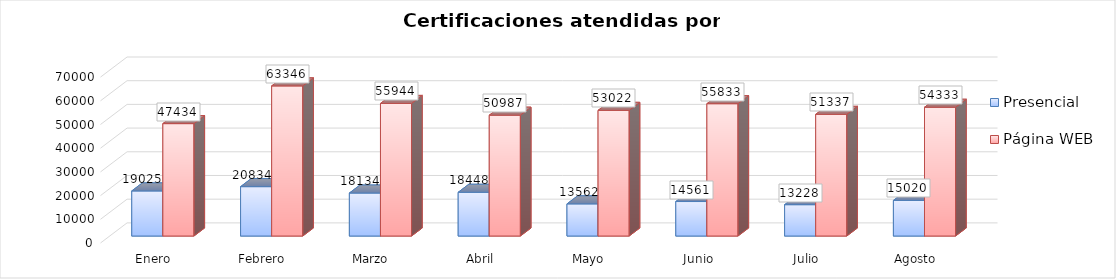
| Category | Presencial | Página WEB |
|---|---|---|
| Enero | 19025 | 47434 |
| Febrero | 20834 | 63346 |
| Marzo | 18134 | 55944 |
| Abril | 18448 | 50987 |
| Mayo | 13562 | 53022 |
| Junio | 14561 | 55833 |
| Julio | 13228 | 51337 |
| Agosto | 15020 | 54333 |